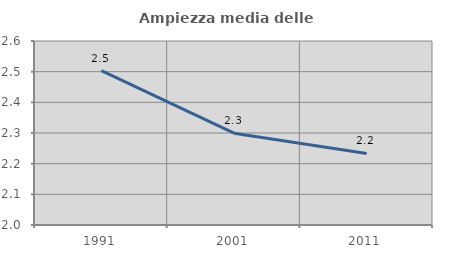
| Category | Ampiezza media delle famiglie |
|---|---|
| 1991.0 | 2.503 |
| 2001.0 | 2.299 |
| 2011.0 | 2.233 |